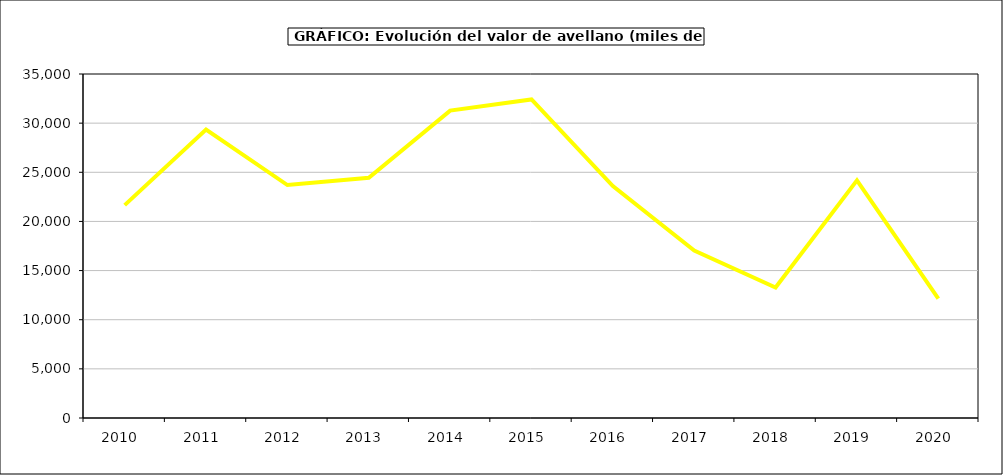
| Category | valor avellano |
|---|---|
| 2010.0 | 21658.97 |
| 2011.0 | 29345.397 |
| 2012.0 | 23700.751 |
| 2013.0 | 24448.005 |
| 2014.0 | 31273.096 |
| 2015.0 | 32413 |
| 2016.0 | 23592 |
| 2017.0 | 17033.361 |
| 2018.0 | 13279.352 |
| 2019.0 | 24182.831 |
| 2020.0 | 12143.344 |